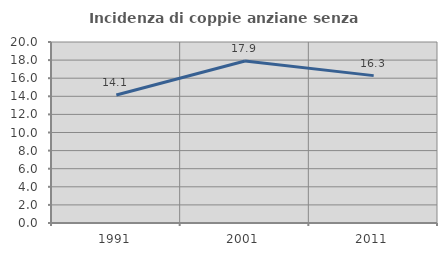
| Category | Incidenza di coppie anziane senza figli  |
|---|---|
| 1991.0 | 14.136 |
| 2001.0 | 17.899 |
| 2011.0 | 16.284 |